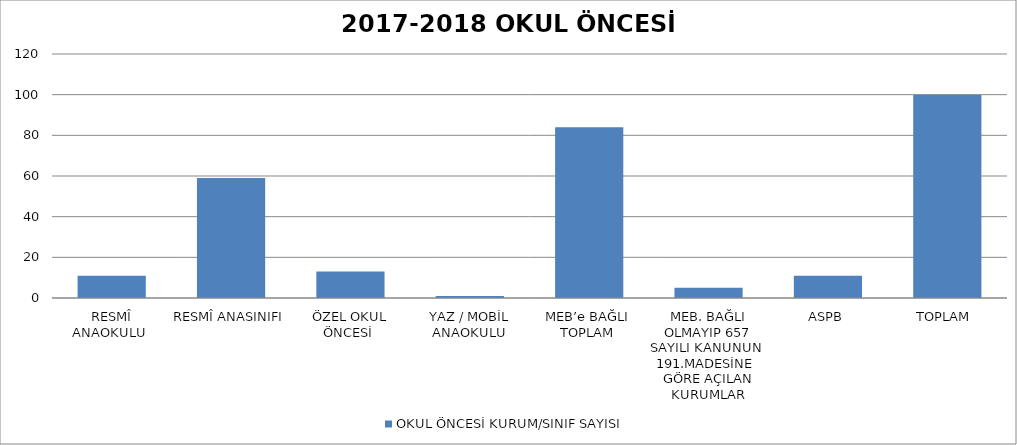
| Category | OKUL ÖNCESİ KURUM/SINIF SAYISI |
|---|---|
| RESMÎ ANAOKULU  | 11 |
| RESMÎ ANASINIFI  | 59 |
| ÖZEL OKUL ÖNCESİ  | 13 |
| YAZ / MOBİL ANAOKULU | 1 |
| MEB’e BAĞLI  TOPLAM  | 84 |
| MEB. BAĞLI OLMAYIP 657 SAYILI KANUNUN  191.MADESİNE  GÖRE AÇILAN KURUMLAR | 5 |
| ASPB | 11 |
| TOPLAM  | 100 |